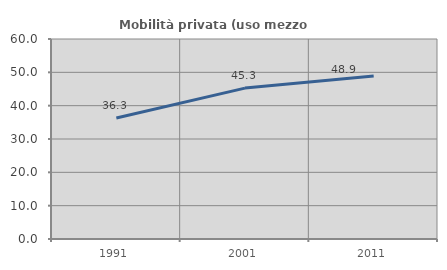
| Category | Mobilità privata (uso mezzo privato) |
|---|---|
| 1991.0 | 36.293 |
| 2001.0 | 45.267 |
| 2011.0 | 48.889 |